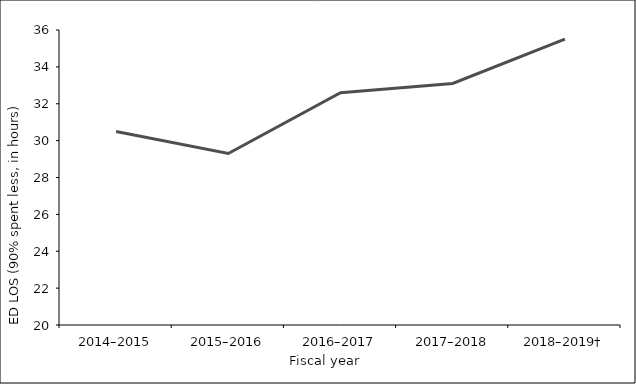
| Category | Series 0 |
|---|---|
| 2014–2015 | 30.5 |
| 2015–2016 | 29.3 |
| 2016–2017 | 32.6 |
| 2017–2018 | 33.1 |
| 2018–2019† | 35.5 |